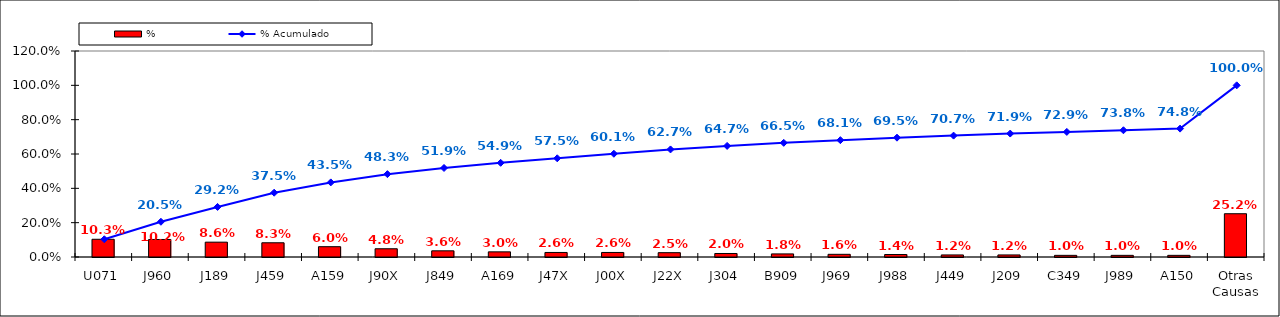
| Category | % |
|---|---|
| U071 | 0.103 |
| J960 | 0.102 |
| J189 | 0.086 |
| J459 | 0.083 |
| A159 | 0.06 |
| J90X | 0.048 |
| J849 | 0.036 |
| A169 | 0.03 |
| J47X | 0.026 |
| J00X | 0.026 |
| J22X | 0.025 |
| J304 | 0.02 |
| B909 | 0.018 |
| J969 | 0.016 |
| J988 | 0.014 |
| J449 | 0.012 |
| J209 | 0.012 |
| C349 | 0.01 |
| J989 | 0.01 |
| A150 | 0.01 |
| Otras Causas | 0.252 |